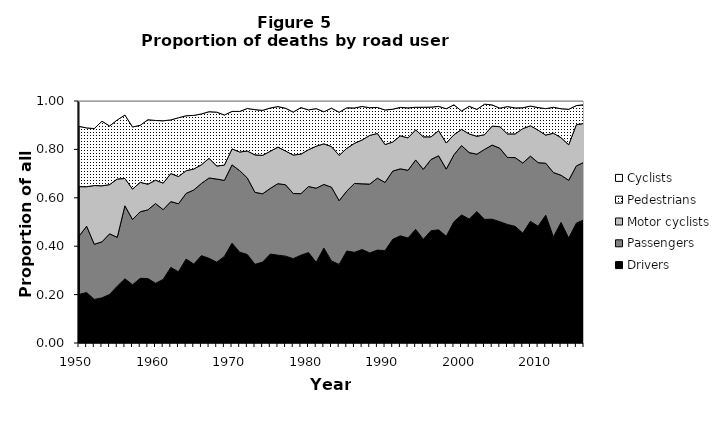
| Category | Drivers | Passengers | Motor cyclists | Pedestrians | Cyclists |
|---|---|---|---|---|---|
| 1950.0 | 0.201 | 0.24 | 0.205 | 0.249 | 0.105 |
| 1951.0 | 0.208 | 0.274 | 0.163 | 0.243 | 0.111 |
| 1952.0 | 0.18 | 0.228 | 0.243 | 0.235 | 0.114 |
| 1953.0 | 0.186 | 0.232 | 0.232 | 0.267 | 0.084 |
| 1954.0 | 0.201 | 0.251 | 0.203 | 0.242 | 0.103 |
| 1955.0 | 0.235 | 0.202 | 0.241 | 0.244 | 0.078 |
| 1956.0 | 0.265 | 0.302 | 0.113 | 0.262 | 0.058 |
| 1957.0 | 0.241 | 0.27 | 0.126 | 0.257 | 0.107 |
| 1958.0 | 0.267 | 0.275 | 0.122 | 0.235 | 0.101 |
| 1959.0 | 0.266 | 0.284 | 0.106 | 0.266 | 0.077 |
| 1960.0 | 0.247 | 0.33 | 0.097 | 0.247 | 0.08 |
| 1961.0 | 0.263 | 0.288 | 0.11 | 0.258 | 0.082 |
| 1962.0 | 0.312 | 0.272 | 0.116 | 0.222 | 0.078 |
| 1963.0 | 0.294 | 0.281 | 0.113 | 0.243 | 0.069 |
| 1964.0 | 0.347 | 0.272 | 0.094 | 0.227 | 0.061 |
| 1965.0 | 0.326 | 0.306 | 0.086 | 0.222 | 0.059 |
| 1966.0 | 0.361 | 0.298 | 0.077 | 0.21 | 0.053 |
| 1967.0 | 0.35 | 0.332 | 0.081 | 0.193 | 0.044 |
| 1968.0 | 0.334 | 0.344 | 0.054 | 0.223 | 0.046 |
| 1969.0 | 0.358 | 0.314 | 0.063 | 0.207 | 0.058 |
| 1970.0 | 0.413 | 0.324 | 0.066 | 0.155 | 0.043 |
| 1971.0 | 0.375 | 0.337 | 0.077 | 0.168 | 0.043 |
| 1972.0 | 0.366 | 0.316 | 0.111 | 0.176 | 0.031 |
| 1973.0 | 0.325 | 0.298 | 0.155 | 0.187 | 0.036 |
| 1974.0 | 0.334 | 0.282 | 0.159 | 0.186 | 0.039 |
| 1975.0 | 0.367 | 0.272 | 0.153 | 0.179 | 0.029 |
| 1976.0 | 0.363 | 0.296 | 0.151 | 0.167 | 0.023 |
| 1977.0 | 0.359 | 0.295 | 0.14 | 0.177 | 0.03 |
| 1978.0 | 0.349 | 0.269 | 0.159 | 0.177 | 0.046 |
| 1979.0 | 0.363 | 0.254 | 0.163 | 0.192 | 0.027 |
| 1980.0 | 0.374 | 0.273 | 0.152 | 0.164 | 0.037 |
| 1981.0 | 0.333 | 0.306 | 0.173 | 0.155 | 0.031 |
| 1982.0 | 0.392 | 0.263 | 0.168 | 0.132 | 0.045 |
| 1983.0 | 0.339 | 0.305 | 0.168 | 0.159 | 0.03 |
| 1984.0 | 0.325 | 0.263 | 0.187 | 0.178 | 0.046 |
| 1985.0 | 0.38 | 0.248 | 0.177 | 0.167 | 0.028 |
| 1986.0 | 0.375 | 0.285 | 0.166 | 0.146 | 0.029 |
| 1987.0 | 0.386 | 0.272 | 0.181 | 0.138 | 0.023 |
| 1988.0 | 0.372 | 0.284 | 0.201 | 0.114 | 0.028 |
| 1989.0 | 0.384 | 0.297 | 0.185 | 0.108 | 0.027 |
| 1990.0 | 0.382 | 0.282 | 0.157 | 0.143 | 0.037 |
| 1991.0 | 0.428 | 0.282 | 0.12 | 0.136 | 0.034 |
| 1992.0 | 0.443 | 0.277 | 0.136 | 0.118 | 0.026 |
| 1993.0 | 0.434 | 0.28 | 0.134 | 0.124 | 0.028 |
| 1994.0 | 0.47 | 0.287 | 0.124 | 0.093 | 0.026 |
| 1995.0 | 0.429 | 0.289 | 0.134 | 0.122 | 0.026 |
| 1996.0 | 0.464 | 0.294 | 0.094 | 0.123 | 0.025 |
| 1997.0 | 0.468 | 0.306 | 0.104 | 0.1 | 0.022 |
| 1998.0 | 0.441 | 0.277 | 0.108 | 0.142 | 0.032 |
| 1999.0 | 0.501 | 0.277 | 0.083 | 0.124 | 0.016 |
| 2000.0 | 0.529 | 0.286 | 0.067 | 0.076 | 0.041 |
| 2001.0 | 0.512 | 0.275 | 0.077 | 0.114 | 0.022 |
| 2002.0 | 0.543 | 0.237 | 0.074 | 0.111 | 0.035 |
| 2003.0 | 0.511 | 0.289 | 0.061 | 0.126 | 0.013 |
| 2004.0 | 0.512 | 0.306 | 0.078 | 0.088 | 0.016 |
| 2005.0 | 0.501 | 0.304 | 0.089 | 0.077 | 0.03 |
| 2006.0 | 0.49 | 0.277 | 0.097 | 0.113 | 0.023 |
| 2007.0 | 0.482 | 0.284 | 0.098 | 0.107 | 0.029 |
| 2008.0 | 0.454 | 0.29 | 0.142 | 0.086 | 0.028 |
| 2009.0 | 0.503 | 0.27 | 0.126 | 0.081 | 0.021 |
| 2010.0 | 0.483 | 0.263 | 0.134 | 0.094 | 0.027 |
| 2011.0 | 0.528 | 0.215 | 0.116 | 0.109 | 0.032 |
| 2012.0 | 0.438 | 0.266 | 0.162 | 0.107 | 0.026 |
| 2013.0 | 0.498 | 0.195 | 0.155 | 0.12 | 0.032 |
| 2014.0 | 0.433 | 0.239 | 0.147 | 0.147 | 0.034 |
| 2015.0 | 0.495 | 0.237 | 0.17 | 0.079 | 0.019 |
| 2016.0 | 0.509 | 0.238 | 0.16 | 0.077 | 0.015 |